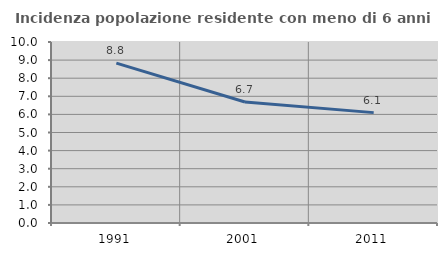
| Category | Incidenza popolazione residente con meno di 6 anni |
|---|---|
| 1991.0 | 8.834 |
| 2001.0 | 6.683 |
| 2011.0 | 6.098 |